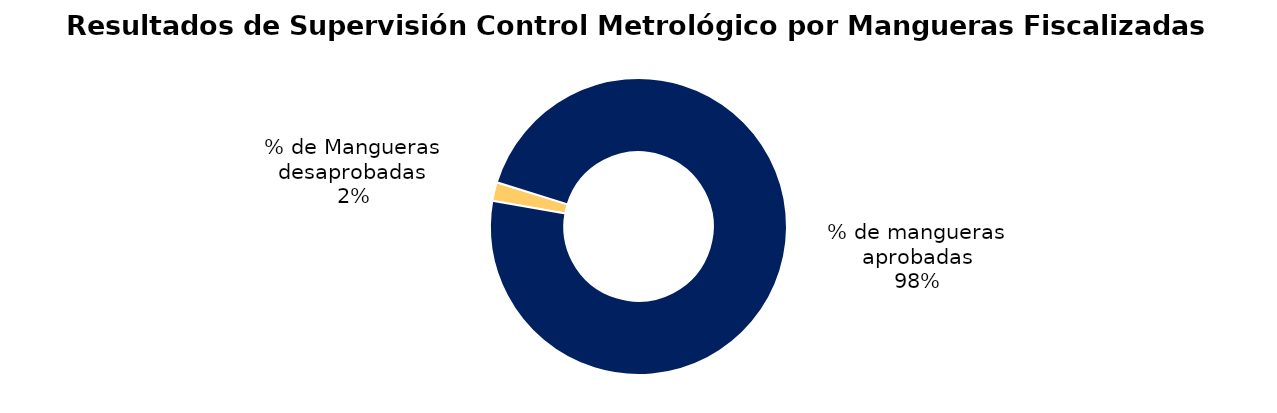
| Category | Series 0 |
|---|---|
| % de Mangueras desaprobadas | 88 |
| % de mangueras aprobadas | 4226 |